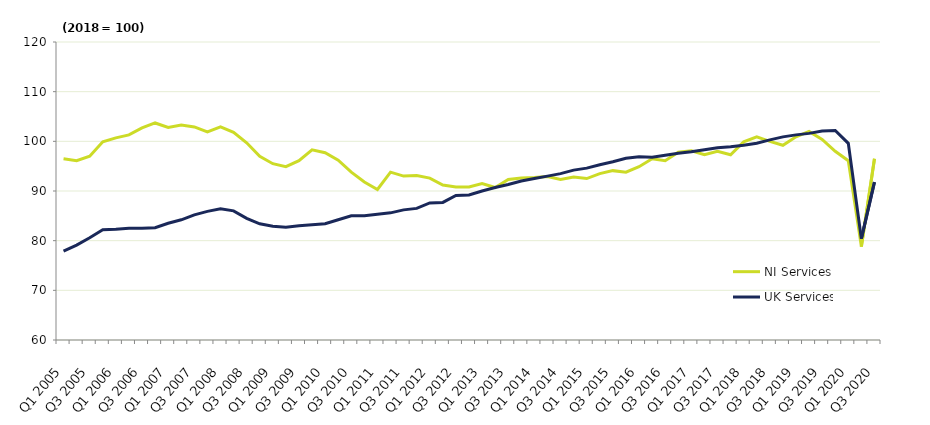
| Category | NI Services | UK Services |
|---|---|---|
| Q1 2005 | 96.5 | 77.9 |
|  | 96.1 | 79.1 |
| Q3 2005 | 97 | 80.6 |
|  | 99.9 | 82.2 |
| Q1 2006 | 100.7 | 82.3 |
|  | 101.3 | 82.5 |
| Q3 2006 | 102.7 | 82.5 |
|  | 103.7 | 82.6 |
| Q1 2007 | 102.8 | 83.5 |
|  | 103.3 | 84.2 |
| Q3 2007 | 102.9 | 85.2 |
|  | 101.9 | 85.9 |
| Q1 2008 | 102.9 | 86.4 |
|  | 101.8 | 86 |
| Q3 2008 | 99.7 | 84.5 |
|  | 97 | 83.4 |
| Q1 2009 | 95.5 | 82.9 |
|  | 94.9 | 82.7 |
| Q3 2009 | 96.1 | 83 |
|  | 98.3 | 83.2 |
| Q1 2010 | 97.7 | 83.4 |
|  | 96.2 | 84.2 |
| Q3 2010 | 93.8 | 85 |
|  | 91.8 | 85 |
| Q1 2011 | 90.3 | 85.3 |
|  | 93.8 | 85.6 |
| Q3 2011 | 93 | 86.2 |
|  | 93.1 | 86.5 |
| Q1 2012 | 92.6 | 87.6 |
|  | 91.2 | 87.7 |
| Q3 2012 | 90.8 | 89.1 |
|  | 90.8 | 89.2 |
| Q1 2013 | 91.5 | 90 |
|  | 90.7 | 90.7 |
| Q3 2013 | 92.3 | 91.3 |
|  | 92.6 | 92 |
| Q1 2014 | 92.7 | 92.5 |
|  | 92.9 | 93 |
| Q3 2014 | 92.3 | 93.5 |
|  | 92.8 | 94.2 |
| Q1 2015 | 92.5 | 94.6 |
|  | 93.5 | 95.3 |
| Q3 2015 | 94.1 | 95.9 |
|  | 93.8 | 96.6 |
| Q1 2016 | 94.9 | 96.9 |
|  | 96.5 | 96.8 |
| Q3 2016 | 96.1 | 97.2 |
|  | 97.8 | 97.6 |
| Q1 2017 | 98.1 | 97.9 |
|  | 97.3 | 98.3 |
| Q3 2017 | 98 | 98.7 |
|  | 97.3 | 98.9 |
| Q1 2018 | 99.9 | 99.2 |
|  | 100.9 | 99.6 |
| Q3 2018 | 100 | 100.3 |
|  | 99.2 | 100.9 |
| Q1 2019 | 100.9 | 101.3 |
|  | 102 | 101.6 |
| Q3 2019 | 100.4 | 102.1 |
|  | 98 | 102.2 |
| Q1 2020 | 96.1 | 99.6 |
|  | 78.8 | 80.4 |
| Q3 2020 | 96.5 | 91.8 |